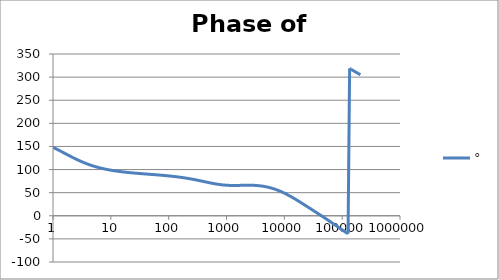
| Category | ° |
|---|---|
| 1.0 | 148.04 |
| 1.0634378492473788 | 146.435 |
| 1.1309000592118907 | 144.791 |
| 1.2026419266820265 | 143.112 |
| 1.278934943925458 | 141.404 |
| 1.3600678260954062 | 139.672 |
| 1.4463476038134566 | 137.922 |
| 1.5381007850634825 | 136.161 |
| 1.6356745907936145 | 134.395 |
| 1.739438268902148 | 132.63 |
| 1.849784491579884 | 130.874 |
| 1.967130841296868 | 129.132 |
| 2.091921391056928 | 127.412 |
| 2.2246283849001642 | 125.718 |
| 2.365754025012901 | 124.056 |
| 2.5158323722080485 | 122.43 |
| 2.6754313669678584 | 120.846 |
| 2.8451549786972743 | 119.306 |
| 3.025645491321301 | 117.814 |
| 3.2175859338757533 | 116.371 |
| 3.42170266528945 | 114.979 |
| 3.6387681231394358 | 113.641 |
| 3.8696037467813236 | 112.355 |
| 4.115083085916729 | 111.123 |
| 4.376135106361553 | 109.944 |
| 4.653747705525078 | 108.818 |
| 4.948971450903514 | 107.744 |
| 5.262923555735513 | 106.72 |
| 5.596792106864742 | 105.745 |
| 5.951840560808945 | 104.819 |
| 6.329412525049976 | 103.938 |
| 6.730936842638569 | 103.101 |
| 7.157932999355504 | 102.307 |
| 7.612016873891456 | 101.554 |
| 8.094906852805886 | 100.839 |
| 8.608430333405762 | 100.161 |
| 9.154530639152917 | 99.518 |
| 9.735274373770007 | 98.908 |
| 10.352859241875105 | 98.33 |
| 11.009622365740512 | 97.78 |
| 11.708049129648925 | 97.259 |
| 12.4507825853165 | 96.763 |
| 13.240633453975693 | 96.292 |
| 14.080590762968805 | 95.844 |
| 14.973833157104059 | 95.417 |
| 15.923740927579823 | 95.01 |
| 16.93390880399795 | 94.621 |
| 18.008159557874837 | 94.249 |
| 19.150558469130036 | 93.893 |
| 20.365428710297824 | 93.551 |
| 21.65736770667993 | 93.222 |
| 23.031264534351347 | 92.906 |
| 24.492318421858034 | 92.6 |
| 26.046058425622668 | 92.304 |
| 27.698364353515743 | 92.016 |
| 29.45548901577305 | 91.736 |
| 31.32408188746347 | 91.463 |
| 33.311214272052936 | 91.195 |
| 35.42440606129053 | 90.932 |
| 37.67165419268462 | 90.672 |
| 40.06146291225952 | 90.415 |
| 42.60287595711691 | 90.159 |
| 45.30551077958928 | 89.904 |
| 48.17959494250036 | 89.649 |
| 51.23600482326248 | 89.393 |
| 54.486306773278585 | 89.134 |
| 57.94280088840825 | 88.873 |
| 61.61856755613799 | 88.607 |
| 65.52751695560372 | 88.337 |
| 69.68444169778837 | 88.061 |
| 74.10507280510043 | 87.778 |
| 78.80613924217637 | 87.487 |
| 83.8054312231895 | 87.187 |
| 89.12186753523771 | 86.878 |
| 94.77556713258299 | 86.558 |
| 100.78792527267464 | 86.227 |
| 107.18169448207877 | 85.882 |
| 113.98107065871142 | 85.525 |
| 121.21178463621371 | 85.152 |
| 128.90119955697148 | 84.764 |
| 137.07841442227294 | 84.359 |
| 145.77437421146283 | 83.937 |
| 155.02198698682062 | 83.496 |
| 164.85624842731968 | 83.037 |
| 175.3143742625403 | 82.557 |
| 186.43594110790573 | 82.057 |
| 198.26303623420247 | 81.537 |
| 210.84041683815525 | 80.995 |
| 224.21567941678887 | 80.431 |
| 238.43943988652958 | 79.847 |
| 253.56552512868072 | 79.241 |
| 269.65117668612646 | 78.616 |
| 286.75726738211927 | 77.971 |
| 304.9485316808965 | 77.309 |
| 324.2938106618788 | 76.63 |
| 344.8663125345048 | 75.938 |
| 366.7438896795682 | 75.235 |
| 390.00933326545766 | 74.524 |
| 414.7506865542229 | 73.809 |
| 441.06157808309626 | 73.095 |
| 469.0415759823428 | 72.386 |
| 498.7965647702637 | 71.686 |
| 530.4391460512702 | 71.002 |
| 564.089064633379 | 70.339 |
| 599.8736616776864 | 69.703 |
| 637.9283565946681 | 69.098 |
| 678.3971595109495 | 68.531 |
| 721.4332162458546 | 68.006 |
| 767.1993878601115 | 67.528 |
| 815.868866969862 | 67.101 |
| 867.6258331583267 | 66.726 |
| 922.6661499653554 | 66.405 |
| 981.1981060925172 | 66.14 |
| 1043.443203628628 | 65.929 |
| 1109.6369962786232 | 65.771 |
| 1180.0299807678607 | 65.663 |
| 1254.8885447951977 | 65.601 |
| 1334.4959751221782 | 65.579 |
| 1419.1535296132129 | 65.593 |
| 1509.1815772837017 | 65.634 |
| 1604.9208106703452 | 65.698 |
| 1706.7335351116335 | 65.775 |
| 1815.0050398174897 | 65.859 |
| 1930.1450559166665 | 65.941 |
| 2052.58930699948 | 66.014 |
| 2182.801158023697 | 66.071 |
| 2321.2733688234066 | 66.104 |
| 2468.5299588567814 | 66.108 |
| 2625.128190249376 | 66.074 |
| 2791.6606766374607 | 65.999 |
| 2968.757625791824 | 65.875 |
| 3157.08922450881 | 65.699 |
| 3357.3681747937244 | 65.465 |
| 3570.352390934236 | 65.17 |
| 3796.8478676703417 | 64.81 |
| 4037.7117303148448 | 64.381 |
| 4293.8554783669315 | 63.881 |
| 4566.248434893605 | 63.306 |
| 4855.9214147324665 | 62.656 |
| 5163.970625397384 | 61.927 |
| 5491.561815449236 | 61.118 |
| 5839.934686030357 | 60.228 |
| 6210.40758225729 | 59.256 |
| 6604.382482225307 | 58.202 |
| 7023.350302504747 | 57.065 |
| 7468.896540206577 | 55.846 |
| 7942.707272968458 | 54.545 |
| 8446.575539567106 | 53.164 |
| 8982.408125302747 | 51.705 |
| 9552.232777834151 | 50.17 |
| 10158.205880770249 | 48.563 |
| 10802.620614058389 | 46.887 |
| 11487.915632049675 | 45.145 |
| 12216.684292082227 | 43.343 |
| 12991.684468506162 | 41.485 |
| 13815.848989288772 | 39.577 |
| 14692.296734695852 | 37.624 |
| 15624.344440049217 | 35.631 |
| 16615.519247226184 | 33.605 |
| 17669.572052398642 | 31.55 |
| 18790.49170052441 | 29.472 |
| 19982.5200803064 | 27.375 |
| 21250.168176743602 | 25.264 |
| 22598.233142021272 | 23.141 |
| 24031.816449341983 | 21.011 |
| 25556.34319839602 | 18.875 |
| 27177.582645530147 | 16.734 |
| 28901.67003630542 | 14.591 |
| 30735.129823066054 | 12.444 |
| 32684.900355380338 | 10.294 |
| 34758.3601367905 | 8.139 |
| 36963.35574723439 | 5.979 |
| 39308.23153680468 | 3.812 |
| 41801.861203217486 | 1.636 |
| 44453.68137248706 | -0.55 |
| 47273.727309885995 | -2.747 |
| 50272.670896332245 | -4.959 |
| 53461.86101391677 | -7.184 |
| 56853.36649340195 | -9.424 |
| 60460.02178621637 | -11.678 |
| 64295.47553378361 | -13.947 |
| 68374.24221798431 | -16.228 |
| 72711.75708821259 | -18.52 |
| 77324.43457288652 | -20.819 |
| 82229.73039646025 | -23.123 |
| 87446.2076370035 | -25.427 |
| 92993.60697433475 | -27.727 |
| 98892.92139454243 | -30.017 |
| 105166.47563360249 | -32.292 |
| 111838.01066072512 | -34.546 |
| 118932.77352114675 | -36.773 |
| 126477.61287835392 | -38.967 |
| 134501.0806172993 | 318.878 |
| 143033.53989310883 | 316.767 |
| 152107.28003416685 | 314.707 |
| 161756.63873440344 | 312.7 |
| 172018.1319971993 | 310.753 |
| 182930.592322653 | 308.868 |
| 194535.31566115122 | 307.049 |
| 206876.217689355 | 305.297 |